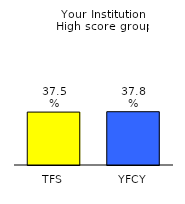
| Category | Series 0 |
|---|---|
| TFS | 0.375 |
| YFCY | 0.378 |